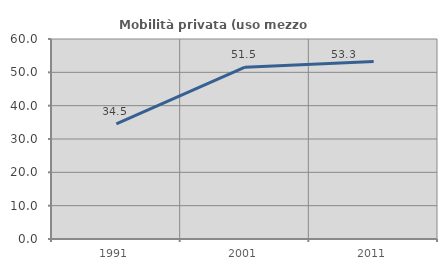
| Category | Mobilità privata (uso mezzo privato) |
|---|---|
| 1991.0 | 34.509 |
| 2001.0 | 51.536 |
| 2011.0 | 53.257 |